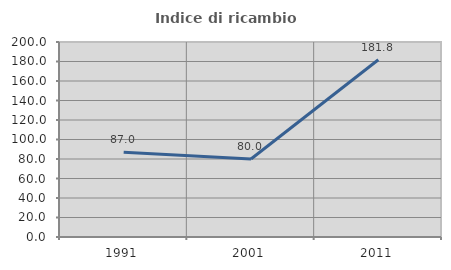
| Category | Indice di ricambio occupazionale  |
|---|---|
| 1991.0 | 86.957 |
| 2001.0 | 80 |
| 2011.0 | 181.818 |